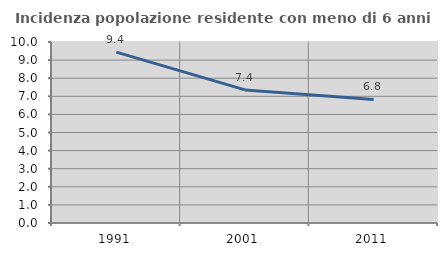
| Category | Incidenza popolazione residente con meno di 6 anni |
|---|---|
| 1991.0 | 9.442 |
| 2001.0 | 7.352 |
| 2011.0 | 6.824 |